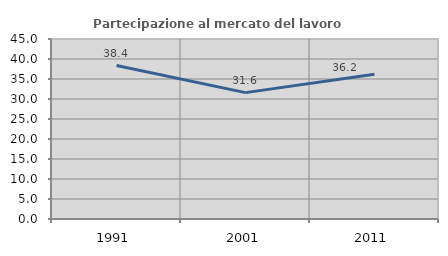
| Category | Partecipazione al mercato del lavoro  femminile |
|---|---|
| 1991.0 | 38.363 |
| 2001.0 | 31.591 |
| 2011.0 | 36.211 |